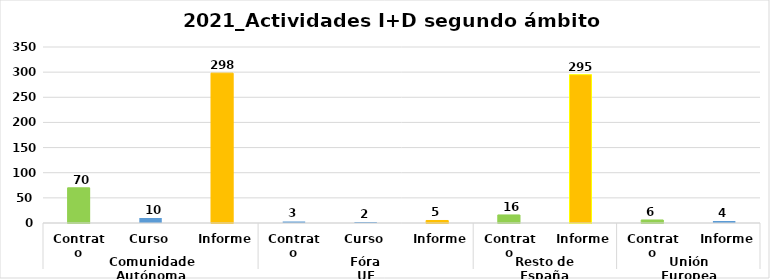
| Category | Series 0 |
|---|---|
| 0 | 70 |
| 1 | 10 |
| 2 | 298 |
| 3 | 3 |
| 4 | 2 |
| 5 | 5 |
| 6 | 16 |
| 7 | 295 |
| 8 | 6 |
| 9 | 4 |